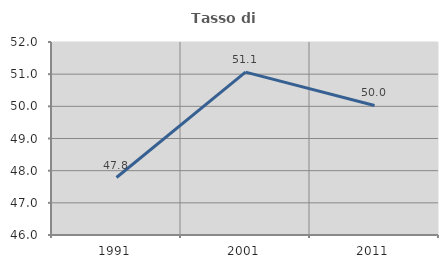
| Category | Tasso di occupazione   |
|---|---|
| 1991.0 | 47.787 |
| 2001.0 | 51.062 |
| 2011.0 | 50.028 |